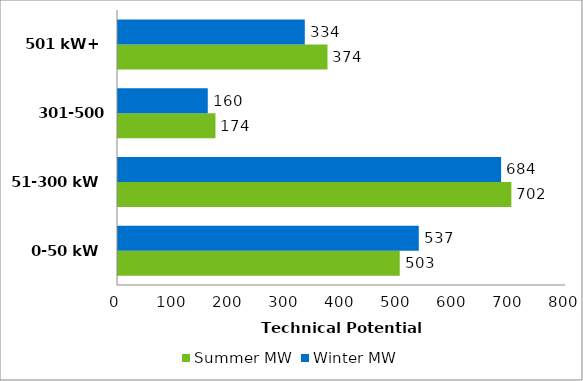
| Category | Summer MW | Winter MW |
|---|---|---|
| 0-50 kW | 503.124 | 537.123 |
| 51-300 kW | 702.432 | 684.147 |
| 301-500 kW | 174.068 | 160.325 |
| 501 kW+ | 374.104 | 333.583 |